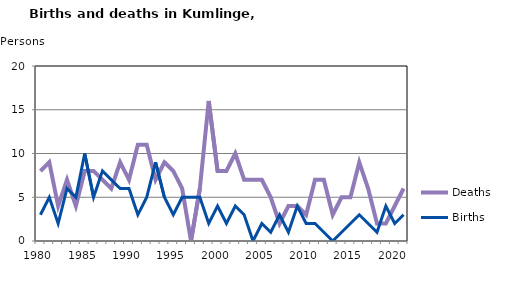
| Category | Deaths | Births |
|---|---|---|
| 1980.0 | 8 | 3 |
| 1981.0 | 9 | 5 |
| 1982.0 | 4 | 2 |
| 1983.0 | 7 | 6 |
| 1984.0 | 4 | 5 |
| 1985.0 | 8 | 10 |
| 1986.0 | 8 | 5 |
| 1987.0 | 7 | 8 |
| 1988.0 | 6 | 7 |
| 1989.0 | 9 | 6 |
| 1990.0 | 7 | 6 |
| 1991.0 | 11 | 3 |
| 1992.0 | 11 | 5 |
| 1993.0 | 7 | 9 |
| 1994.0 | 9 | 5 |
| 1995.0 | 8 | 3 |
| 1996.0 | 6 | 5 |
| 1997.0 | 0 | 5 |
| 1998.0 | 6 | 5 |
| 1999.0 | 16 | 2 |
| 2000.0 | 8 | 4 |
| 2001.0 | 8 | 2 |
| 2002.0 | 10 | 4 |
| 2003.0 | 7 | 3 |
| 2004.0 | 7 | 0 |
| 2005.0 | 7 | 2 |
| 2006.0 | 5 | 1 |
| 2007.0 | 2 | 3 |
| 2008.0 | 4 | 1 |
| 2009.0 | 4 | 4 |
| 2010.0 | 3 | 2 |
| 2011.0 | 7 | 2 |
| 2012.0 | 7 | 1 |
| 2013.0 | 3 | 0 |
| 2014.0 | 5 | 1 |
| 2015.0 | 5 | 2 |
| 2016.0 | 9 | 3 |
| 2017.0 | 6 | 2 |
| 2018.0 | 2 | 1 |
| 2019.0 | 2 | 4 |
| 2020.0 | 4 | 2 |
| 2021.0 | 6 | 3 |